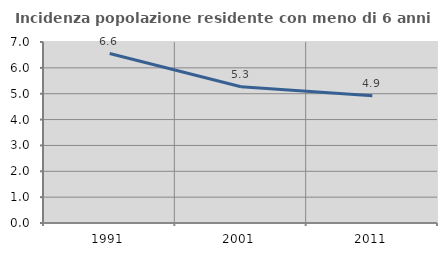
| Category | Incidenza popolazione residente con meno di 6 anni |
|---|---|
| 1991.0 | 6.553 |
| 2001.0 | 5.267 |
| 2011.0 | 4.924 |